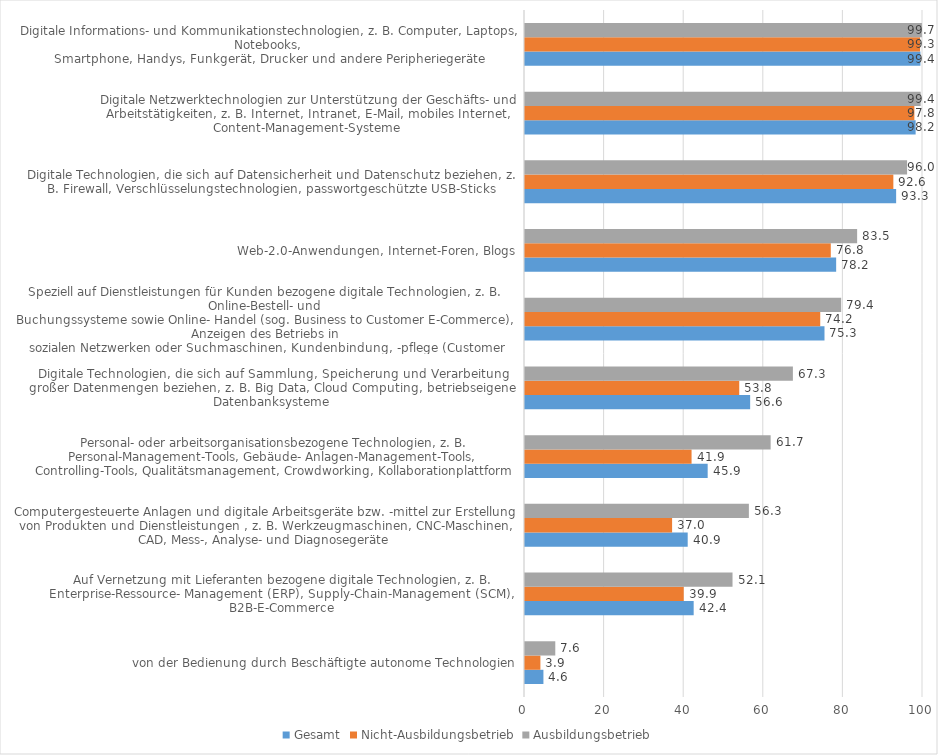
| Category | Gesamt | Nicht-Ausbildungsbetrieb | Ausbildungsbetrieb |
|---|---|---|---|
| von der Bedienung durch Beschäftigte autonome Technologien | 4.63 | 3.87 | 7.61 |
| Auf Vernetzung mit Lieferanten bezogene digitale Technologien, z. B. Enterprise-Ressource- Management (ERP), Supply-Chain-Management (SCM), B2B-E-Commerce | 42.38 | 39.88 | 52.14 |
| Computergesteuerte Anlagen und digitale Arbeitsgeräte bzw. -mittel zur Erstellung von Produkten und Dienstleistungen , z. B. Werkzeugmaschinen, CNC-Maschinen, CAD, Mess-, Analyse- und Diagnosegeräte | 40.88 | 36.96 | 56.25 |
| Personal- oder arbeitsorganisationsbezogene Technologien, z. B. Personal-Management-Tools, Gebäude- Anlagen-Management-Tools, Controlling-Tools, Qualitätsmanagement, Crowdworking, Kollaborationplattform | 45.9 | 41.85 | 61.72 |
| Digitale Technologien, die sich auf Sammlung, Speicherung und Verarbeitung großer Datenmengen beziehen, z. B. Big Data, Cloud Computing, betriebseigene Datenbanksysteme | 56.57 | 53.83 | 67.31 |
| Speziell auf Dienstleistungen für Kunden bezogene digitale Technologien, z. B. Online-Bestell- und
Buchungssysteme sowie Online- Handel (sog. Business to Customer E-Commerce), Anzeigen des Betriebs in
sozialen Netzwerken oder Suchmaschinen, Kundenbindung, | 75.25 | 74.18 | 79.44 |
| Web-2.0-Anwendungen, Internet-Foren, Blogs | 78.18 | 76.83 | 83.45 |
| Digitale Technologien, die sich auf Datensicherheit und Datenschutz beziehen, z. B. Firewall, Verschlüsselungstechnologien, passwortgeschützte USB-Sticks | 93.25 | 92.55 | 96 |
| Digitale Netzwerktechnologien zur Unterstützung der Geschäfts- und Arbeitstätigkeiten, z. B. Internet, Intranet, E-Mail, mobiles Internet, Content-Management-Systeme | 98.15 | 97.83 | 99.41 |
| Digitale Informations- und Kommunikationstechnologien, z. B. Computer, Laptops, Notebooks,
Smartphone, Handys, Funkgerät, Drucker und andere Peripheriegeräte | 99.35 | 99.26 | 99.72 |